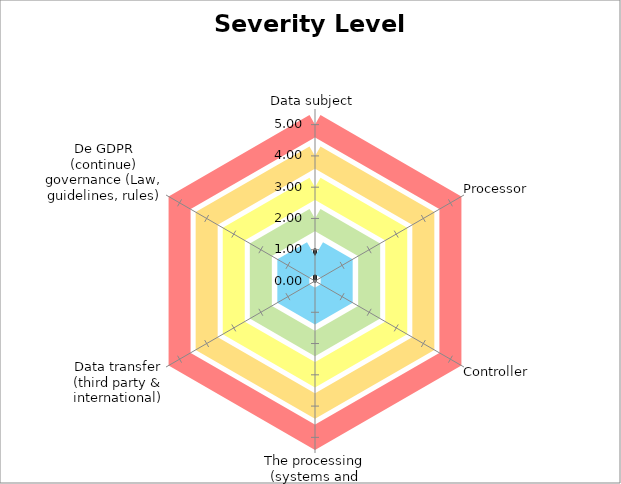
| Category | Average | Max | B | G | Y | O | R |
|---|---|---|---|---|---|---|---|
| Data subject | 1 | 1 | 0.8 | 2 | 3 | 4 | 5 |
| Processor | 0 | 0 | 0.8 | 2 | 3 | 4 | 5 |
| Controller | 0 | 0 | 0.8 | 2 | 3 | 4 | 5 |
| The processing (systems and related processes)   | 0 | 0 | 0.8 | 2 | 3 | 4 | 5 |
| Data transfer (third party & international) | 0 | 0 | 0.8 | 2 | 3 | 4 | 5 |
| De GDPR (continue) governance (Law, guidelines, rules) | 0 | 0 | 0.8 | 2 | 3 | 4 | 5 |